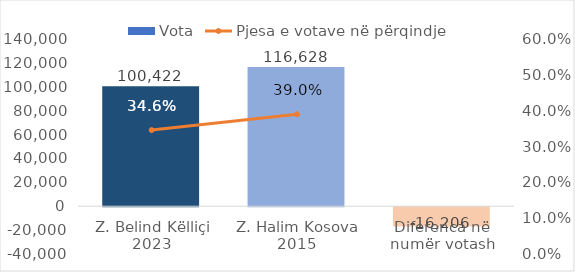
| Category | Vota |
|---|---|
| Z. Belind Këlliçi 2023 | 100422 |
| Z. Halim Kosova 2015 | 116628 |
| Diferenca në numër votash | -16206 |